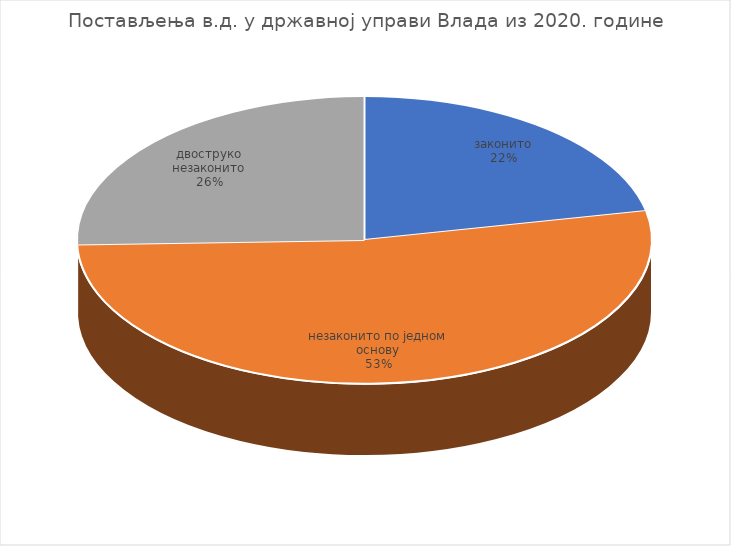
| Category | Series 0 |
|---|---|
| законито | 274 |
| незаконито по једном основу | 663 |
| двоструко незаконито | 321 |